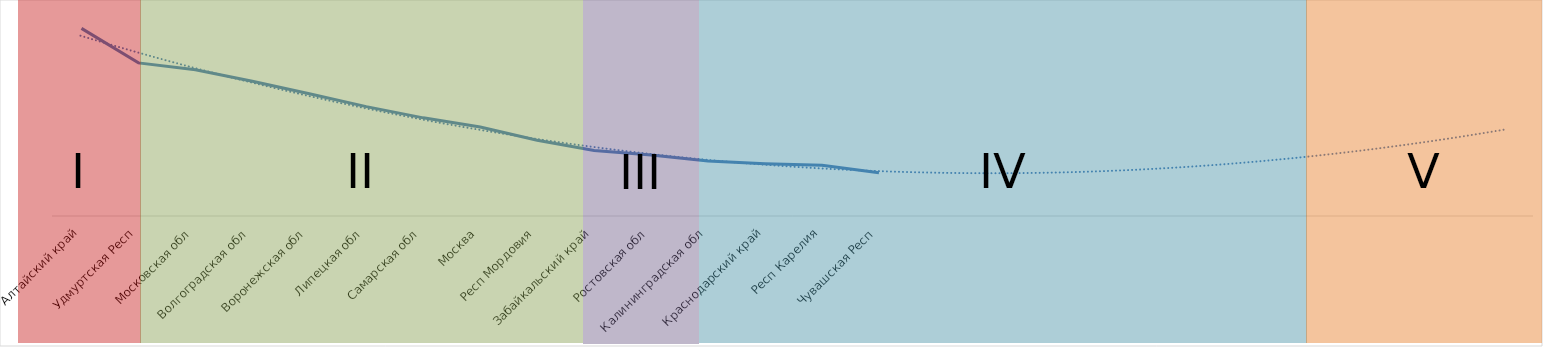
| Category | Series 0 |
|---|---|
| Алтайский край | 154.85 |
| Удмуртская Респ | 126.35 |
| Московская обл | 120.75 |
| Волгоградская обл | 111.25 |
| Воронежская обл | 100.95 |
| Липецкая обл | 90.25 |
| Самарская обл | 81 |
| Москва | 73.5 |
| Респ Мордовия | 62.45 |
| Забайкальский край | 54.1 |
| Ростовская обл | 50.4 |
| Калининградская обл | 45.45 |
| Краснодарский край | 43.15 |
| Респ Карелия | 41.85 |
| Чувашская Респ | 35.75 |